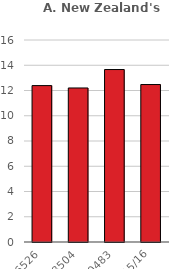
| Category | #REF! |
|---|---|
| 36526 | 12.388 |
| 38504 | 12.2 |
| 40483 | 13.66 |
| 2015/16 | 12.472 |